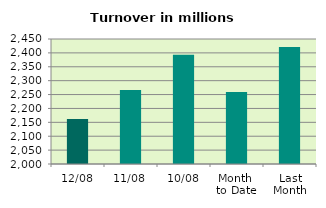
| Category | Series 0 |
|---|---|
| 12/08 | 2161.682 |
| 11/08 | 2266.049 |
| 10/08 | 2392.992 |
| Month 
to Date | 2259.229 |
| Last
Month | 2421.628 |